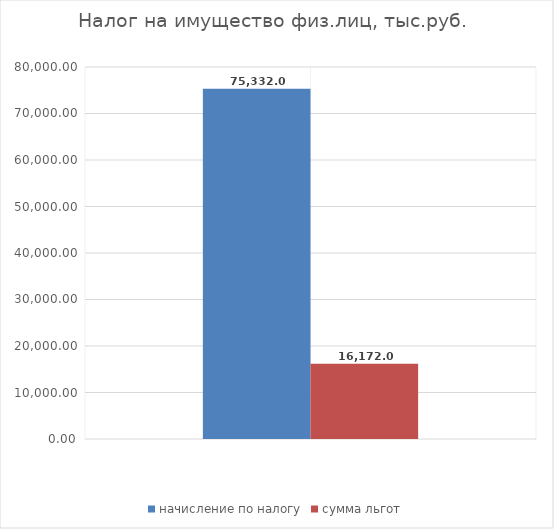
| Category | начисление по налогу | сумма льгот |
|---|---|---|
| 0 | 75332 | 16172 |